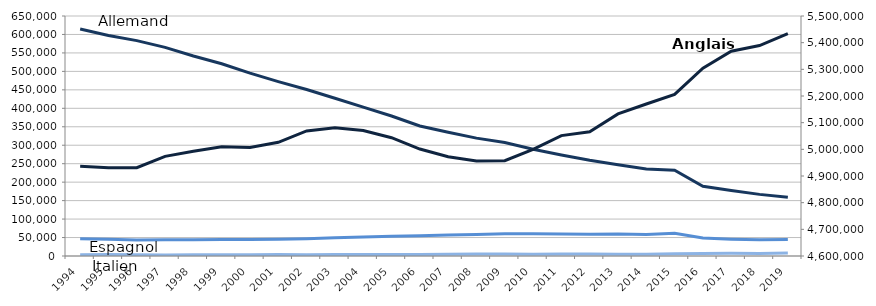
| Category | Allemand | Espagnol | Italien |
|---|---|---|---|
| 1994 | 614664 | 46932 | 3592 |
| 1995 | 597301 | 45130 | 3773 |
| 1996 | 583355 | 43347 | 3170 |
| 1997 | 565117 | 43822 | 2899 |
| 1998 | 541700 | 44297 | 3249 |
| 1999 | 520542 | 44505 | 3117 |
| 2000 | 495278 | 44519 | 3407 |
| 2001 | 472196 | 45380 | 3755 |
| 2002 | 450764 | 46758 | 3678 |
| 2003 | 427217 | 49748 | 3867 |
| 2004 | 403147 | 51245 | 3915 |
| 2005 | 379140 | 53227 | 3992 |
| 2006 | 351994 | 54918 | 4100 |
| 2007 | 335081 | 56891 | 4565 |
| 2008 | 319233 | 58139 | 5084 |
| 2009 | 307294 | 60446 | 5174 |
| 2010 | 288902 | 60160 | 5046 |
| 2011 | 273552 | 59609 | 5137 |
| 2012 | 259322 | 58937 | 5426 |
| 2013 | 247381 | 59599 | 4809 |
| 2014 | 235812 | 58291 | 5058 |
| 2015 | 232126 | 61403 | 5849 |
| 2016 | 188656 | 48484 | 6949 |
| 2017 | 177285 | 45436 | 7282 |
| 2018 | 166874 | 43764 | 7010 |
| 2019 | 158915 | 44478 | 8221 |